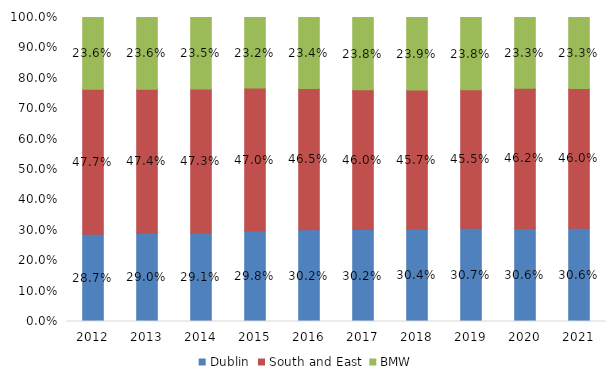
| Category | Dublin | South and East | BMW |
|---|---|---|---|
| 2012.0 | 0.287 | 0.477 | 0.236 |
| 2013.0 | 0.29 | 0.474 | 0.236 |
| 2014.0 | 0.291 | 0.473 | 0.235 |
| 2015.0 | 0.298 | 0.47 | 0.232 |
| 2016.0 | 0.302 | 0.465 | 0.234 |
| 2017.0 | 0.302 | 0.46 | 0.238 |
| 2018.0 | 0.304 | 0.457 | 0.239 |
| 2019.0 | 0.307 | 0.455 | 0.238 |
| 2020.0 | 0.306 | 0.462 | 0.233 |
| 2021.0 | 0.306 | 0.46 | 0.233 |